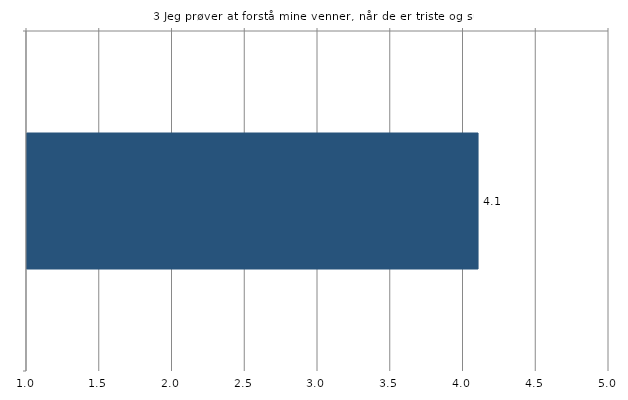
| Category | Gns. |
|---|---|
|   | 4.1 |